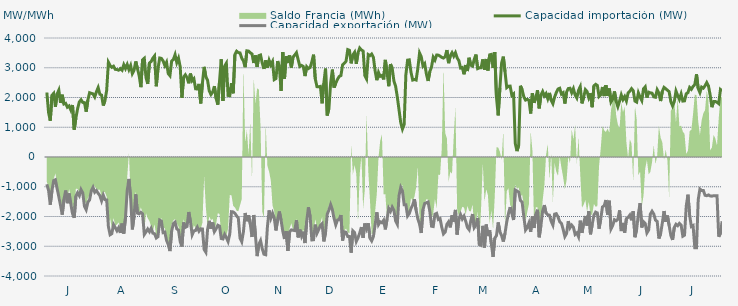
| Category | Capacidad importación (MW) | Capacidad exportación (MW) |
|---|---|---|
| 0 | 2167.583 | -916.667 |
| 1900-01-01 | 1493.75 | -1122.25 |
| 1900-01-02 | 1220.833 | -1604.167 |
| 1900-01-03 | 2072.917 | -1125 |
| 1900-01-04 | 2139.583 | -791.667 |
| 1900-01-05 | 1687.5 | -764.583 |
| 1900-01-06 | 2116.667 | -1058.333 |
| 1900-01-07 | 2247.917 | -1337.5 |
| 1900-01-08 | 1818.75 | -1627.083 |
| 1900-01-09 | 2093.75 | -1937.5 |
| 1900-01-10 | 1781.25 | -1422.917 |
| 1900-01-11 | 1804.167 | -1127.083 |
| 1900-01-12 | 1675 | -1552.083 |
| 1900-01-13 | 1716.667 | -1225 |
| 1900-01-14 | 1583.333 | -1570.833 |
| 1900-01-15 | 1747.917 | -1904.167 |
| 1900-01-16 | 918.75 | -2042.875 |
| 1900-01-17 | 1314.583 | -1310.417 |
| 1900-01-18 | 1629.167 | -1200 |
| 1900-01-19 | 1852.083 | -1300.583 |
| 1900-01-20 | 1925 | -1095.833 |
| 1900-01-21 | 1835.417 | -1208.333 |
| 1900-01-22 | 1827.083 | -1656.25 |
| 1900-01-23 | 1522.917 | -1770.917 |
| 1900-01-24 | 1916.667 | -1518.75 |
| 1900-01-25 | 2160.417 | -1441.667 |
| 1900-01-26 | 2139.583 | -1137.5 |
| 1900-01-27 | 2120.833 | -1018.75 |
| 1900-01-28 | 2018.75 | -1183.333 |
| 1900-01-29 | 2193.75 | -1127.083 |
| 1900-01-30 | 2333.333 | -1220.833 |
| 1900-01-31 | 2108.333 | -1295.833 |
| 1900-02-01 | 2079.833 | -1472.917 |
| 1900-02-02 | 1729.167 | -1281.25 |
| 1900-02-03 | 1897.917 | -1434.542 |
| 1900-02-04 | 2247 | -1443.75 |
| 1900-02-05 | 3185.083 | -2337 |
| 1900-02-06 | 3075.167 | -2613.625 |
| 1900-02-07 | 3013.625 | -2576.5 |
| 1900-02-08 | 3052.042 | -2269.25 |
| 1900-02-09 | 2946.333 | -2370.833 |
| 1900-02-10 | 2940.542 | -2478.958 |
| 1900-02-11 | 2917.208 | -2375.625 |
| 1900-02-12 | 2971.167 | -2551.875 |
| 1900-02-13 | 2917.292 | -2238 |
| 1900-02-14 | 3101.958 | -2573.167 |
| 1900-02-15 | 2973.375 | -2041.667 |
| 1900-02-16 | 3109.875 | -1120.167 |
| 1900-02-17 | 2936.333 | -737.5 |
| 1900-02-18 | 3074.833 | -1371.667 |
| 1900-02-19 | 2802.417 | -2434.917 |
| 1900-02-20 | 2913.625 | -1996.875 |
| 1900-02-21 | 3212.125 | -1254.167 |
| 1900-02-22 | 2973 | -1887.5 |
| 1900-02-23 | 2732 | -1910.417 |
| 1900-02-24 | 2348.333 | -1858 |
| 1900-02-25 | 3266 | -1911.25 |
| 1900-02-26 | 3318.417 | -2603.917 |
| 1900-02-27 | 2666.292 | -2519.292 |
| 1900-02-28 | 2457.667 | -2420.375 |
| 1900-02-28 | 3159.917 | -2510.583 |
| 1900-03-01 | 3208.208 | -2395.833 |
| 1900-03-02 | 3322.042 | -2559.25 |
| 1900-03-03 | 3397.292 | -2579.208 |
| 1900-03-04 | 2377.292 | -2722 |
| 1900-03-05 | 2966.875 | -2678.583 |
| 1900-03-06 | 3327.583 | -2120.833 |
| 1900-03-07 | 3314.125 | -2154.167 |
| 1900-03-08 | 3229.625 | -2542.417 |
| 1900-03-09 | 3075.125 | -2524.125 |
| 1900-03-10 | 3186.833 | -2800.875 |
| 1900-03-11 | 2804.417 | -2944.208 |
| 1900-03-12 | 2733.75 | -3162.5 |
| 1900-03-13 | 3225.458 | -2491.042 |
| 1900-03-14 | 3275.667 | -2238.417 |
| 1900-03-15 | 3439.5 | -2190.417 |
| 1900-03-16 | 3175.292 | -2417.375 |
| 1900-03-17 | 3321.875 | -2458.417 |
| 1900-03-18 | 3034.917 | -2846.167 |
| 1900-03-19 | 1991.917 | -3010.667 |
| 1900-03-20 | 2685.833 | -2200.25 |
| 1900-03-21 | 2763.167 | -2365.208 |
| 1900-03-22 | 2664.875 | -2334.375 |
| 1900-03-23 | 2477.792 | -1849.417 |
| 1900-03-24 | 2804.25 | -2175.083 |
| 1900-03-25 | 2563.458 | -2614.833 |
| 1900-03-26 | 2629.917 | -2484.333 |
| 1900-03-27 | 2292 | -2469.792 |
| 1900-03-28 | 2284.542 | -2356.917 |
| 1900-03-29 | 2456.5 | -2494.792 |
| 1900-03-30 | 1801.792 | -2413.833 |
| 1900-03-31 | 2484.917 | -2419 |
| 1900-04-01 | 3029.417 | -3108.292 |
| 1900-04-02 | 2693.417 | -3201.125 |
| 1900-04-03 | 2579.5 | -2439 |
| 1900-04-04 | 2220.833 | -2146.167 |
| 1900-04-05 | 2100 | -2410.292 |
| 1900-04-06 | 2179.167 | -2202.083 |
| 1900-04-07 | 2381.25 | -2508.5 |
| 1900-04-08 | 1970.833 | -2414.375 |
| 1900-04-09 | 1758.333 | -2292.792 |
| 1900-04-10 | 2544 | -2324.083 |
| 1900-04-11 | 3285.125 | -2739.75 |
| 1900-04-12 | 1885.375 | -2754.917 |
| 1900-04-13 | 3057.958 | -2601 |
| 1900-04-14 | 3152.583 | -2708.375 |
| 1900-04-15 | 2068.833 | -2840.833 |
| 1900-04-16 | 2060.917 | -2586.417 |
| 1900-04-17 | 2484.25 | -1839.417 |
| 1900-04-18 | 2141.208 | -1845.833 |
| 1900-04-19 | 3445.375 | -1893.75 |
| 1900-04-20 | 3555.25 | -1979.583 |
| 1900-04-21 | 3506.875 | -2054.167 |
| 1900-04-22 | 3499.292 | -2730 |
| 1900-04-23 | 3321.917 | -2848.375 |
| 1900-04-24 | 3225.583 | -2505.583 |
| 1900-04-25 | 3019.583 | -1882.958 |
| 1900-04-26 | 3568.667 | -2157.833 |
| 1900-04-27 | 3559.375 | -1957.75 |
| 1900-04-28 | 3503.125 | -2252.375 |
| 1900-04-29 | 3464.458 | -2689.458 |
| 1900-04-30 | 3159.52 | -1949.52 |
| 1900-05-01 | 3414.875 | -2624.75 |
| 1900-05-02 | 3028.417 | -3331.875 |
| 1900-05-03 | 3406.833 | -2936.5 |
| 1900-05-04 | 3428.875 | -2811.25 |
| 1900-05-05 | 3154.208 | -3088.625 |
| 1900-05-06 | 2961.542 | -3268.083 |
| 1900-05-07 | 3246.75 | -3285.125 |
| 1900-05-08 | 2998.792 | -2359.333 |
| 1900-05-09 | 3250.625 | -1795.833 |
| 1900-05-10 | 3098.083 | -2058.458 |
| 1900-05-11 | 3208.458 | -1889.583 |
| 1900-05-12 | 2600.833 | -2050 |
| 1900-05-13 | 2636.458 | -2468.208 |
| 1900-05-14 | 3221.75 | -2100 |
| 1900-05-15 | 3030.917 | -1831.25 |
| 1900-05-16 | 2221.417 | -2127.083 |
| 1900-05-17 | 3529.833 | -2490.5 |
| 1900-05-18 | 2631.583 | -2756.25 |
| 1900-05-19 | 3389.417 | -2493.667 |
| 1900-05-20 | 3161.917 | -3158.375 |
| 1900-05-21 | 3412.417 | -2518.792 |
| 1900-05-22 | 3004.917 | -2450.333 |
| 1900-05-23 | 3360.75 | -2463.25 |
| 1900-05-24 | 3427.958 | -2474.292 |
| 1900-05-25 | 3506.917 | -2123.5 |
| 1900-05-26 | 3269.708 | -2701.708 |
| 1900-05-27 | 3043.333 | -2440.417 |
| 1900-05-28 | 3078.833 | -2660.667 |
| 1900-05-29 | 3042.542 | -2510.25 |
| 1900-05-30 | 2720.083 | -2892.208 |
| 1900-05-31 | 3035.792 | -2156.833 |
| 1900-06-01 | 2973.125 | -1691.667 |
| 1900-06-02 | 3008.708 | -2006.25 |
| 1900-06-03 | 3198.417 | -2788.271 |
| 1900-06-04 | 3439.5 | -2780.875 |
| 1900-06-05 | 2626.625 | -2273 |
| 1900-06-06 | 2364.583 | -2564.167 |
| 1900-06-07 | 2360.417 | -2440.708 |
| 1900-06-08 | 2372.917 | -2302.125 |
| 1900-06-09 | 1804.167 | -2241.25 |
| 1900-06-10 | 2476.875 | -2836.292 |
| 1900-06-11 | 2972.208 | -2552.292 |
| 1900-06-12 | 1394.917 | -1922 |
| 1900-06-13 | 1635.417 | -1780.667 |
| 1900-06-14 | 2487.208 | -1602.083 |
| 1900-06-15 | 2938.333 | -1770.833 |
| 1900-06-16 | 2333.708 | -2058.75 |
| 1900-06-17 | 2480.333 | -2280.5 |
| 1900-06-18 | 2612.458 | -2120.333 |
| 1900-06-19 | 2705.792 | -2095.25 |
| 1900-06-20 | 2735.375 | -1951.833 |
| 1900-06-21 | 3100.375 | -2807.583 |
| 1900-06-22 | 3154.125 | -2514.417 |
| 1900-06-23 | 3216.042 | -2530.208 |
| 1900-06-24 | 3609.167 | -2672.875 |
| 1900-06-25 | 3585.958 | -2674.5 |
| 1900-06-26 | 3148.417 | -3214.25 |
| 1900-06-27 | 3433.542 | -2480.667 |
| 1900-06-28 | 3518.5 | -2539.5 |
| 1900-06-29 | 3130.292 | -2838.583 |
| 1900-06-30 | 3499.167 | -2718.417 |
| 1900-07-01 | 3663.042 | -2554.083 |
| 1900-07-02 | 3596.708 | -2355.75 |
| 1900-07-03 | 3562.792 | -2716.417 |
| 1900-07-04 | 2738.75 | -2235.333 |
| 1900-07-05 | 2625.667 | -2410 |
| 1900-07-06 | 3444.083 | -2226.333 |
| 1900-07-07 | 3408.75 | -2728 |
| 1900-07-08 | 3460.583 | -2820.25 |
| 1900-07-09 | 3350.75 | -2676.083 |
| 1900-07-10 | 2899.917 | -2289.583 |
| 1900-07-11 | 2581.708 | -1858.083 |
| 1900-07-12 | 2842.042 | -2272.417 |
| 1900-07-13 | 2711.125 | -2177.417 |
| 1900-07-14 | 2740.458 | -2209.667 |
| 1900-07-15 | 2608.583 | -2127.083 |
| 1900-07-16 | 3264.042 | -2433.083 |
| 1900-07-17 | 2836.375 | -2085.417 |
| 1900-07-18 | 2379.792 | -1727.083 |
| 1900-07-19 | 3123.25 | -1827.083 |
| 1900-07-20 | 2982.792 | -1681.25 |
| 1900-07-21 | 2556.667 | -1789.667 |
| 1900-07-22 | 2375.667 | -2149.333 |
| 1900-07-23 | 2017.208 | -2261.458 |
| 1900-07-24 | 1585 | -1297.917 |
| 1900-07-25 | 1154.167 | -1022.917 |
| 1900-07-26 | 939.583 | -1143.75 |
| 1900-07-27 | 1093.75 | -1604.167 |
| 1900-07-28 | 2763.333 | -1604.167 |
| 1900-07-29 | 3256.375 | -1980.875 |
| 1900-07-30 | 3265.958 | -1897.917 |
| 1900-07-31 | 2849.625 | -1726.333 |
| 1900-08-01 | 2586.542 | -1614.583 |
| 1900-08-02 | 2607.375 | -1416.667 |
| 1900-08-03 | 2587.208 | -1789.583 |
| 1900-08-04 | 2978.5 | -2081.25 |
| 1900-08-05 | 3497.083 | -2256.292 |
| 1900-08-06 | 3370 | -2554.542 |
| 1900-08-07 | 3061.75 | -1771.917 |
| 1900-08-08 | 3134.875 | -1562.5 |
| 1900-08-09 | 2789.5 | -1537.5 |
| 1900-08-10 | 2555.75 | -1512.5 |
| 1900-08-11 | 2867.083 | -1825 |
| 1900-08-12 | 3026.833 | -2326.458 |
| 1900-08-13 | 3354.833 | -2337.292 |
| 1900-08-14 | 3258.292 | -1924.167 |
| 1900-08-15 | 3426.125 | -1893.75 |
| 1900-08-16 | 3424.167 | -2100 |
| 1900-08-17 | 3391.208 | -2070.833 |
| 1900-08-18 | 3348.208 | -2362.208 |
| 1900-08-19 | 3325.958 | -2584.917 |
| 1900-08-20 | 3372.292 | -2526.125 |
| 1900-08-21 | 3594.458 | -2261.833 |
| 1900-08-22 | 3154.208 | -2177.542 |
| 1900-08-23 | 3406.542 | -2366 |
| 1900-08-24 | 3506.792 | -1962 |
| 1900-08-25 | 3388.292 | -2170.833 |
| 1900-08-26 | 3502.625 | -1778.917 |
| 1900-08-27 | 3329.875 | -2606.583 |
| 1900-08-28 | 3238.958 | -2081.917 |
| 1900-08-29 | 2990.542 | -1937.25 |
| 1900-08-30 | 3009.542 | -2084.208 |
| 1900-08-31 | 2780.333 | -1987.25 |
| 1900-09-01 | 3090.792 | -2157.25 |
| 1900-09-02 | 2889.375 | -2369.167 |
| 1900-09-03 | 3335.375 | -2443.917 |
| 1900-09-04 | 3086.625 | -2135.417 |
| 1900-09-05 | 3054 | -1916.417 |
| 1900-09-06 | 3285.417 | -2373 |
| 1900-09-07 | 3443.292 | -2289.333 |
| 1900-09-08 | 2971.208 | -2047.917 |
| 1900-09-09 | 2996.292 | -2944.458 |
| 1900-09-10 | 3001.167 | -2971.542 |
| 1900-09-11 | 3281.375 | -2314.833 |
| 1900-09-12 | 2936.042 | -3043.167 |
| 1900-09-13 | 3294.792 | -2270.333 |
| 1900-09-14 | 2907.375 | -2657.667 |
| 1900-09-15 | 3433.583 | -2462.5 |
| 1900-09-16 | 3449.042 | -2914.583 |
| 1900-09-17 | 2992.458 | -3358.458 |
| 1900-09-18 | 3524.375 | -2728.208 |
| 1900-09-19 | 2000 | -2643.375 |
| 1900-09-20 | 1400 | -2200 |
| 1900-09-21 | 2323.375 | -2514.75 |
| 1900-09-22 | 3160.167 | -2645.333 |
| 1900-09-23 | 3372.083 | -2842.167 |
| 1900-09-24 | 2865.739 | -2564.565 |
| 1900-09-25 | 2332.667 | -2181.833 |
| 1900-09-26 | 2376.083 | -1906.25 |
| 1900-09-27 | 2381.25 | -1683.333 |
| 1900-09-28 | 2070.833 | -1891.667 |
| 1900-09-29 | 2120.083 | -2118.75 |
| 1900-09-30 | 449.25 | -1108.333 |
| 1900-10-01 | 200 | -1139.583 |
| 1900-10-02 | 395.833 | -1179.167 |
| 1900-10-03 | 2393.75 | -1462.5 |
| 1900-10-04 | 2262.25 | -1512.5 |
| 1900-10-05 | 2020.833 | -2007.167 |
| 1900-10-06 | 1912.5 | -2455.208 |
| 1900-10-07 | 1939.583 | -2371.125 |
| 1900-10-08 | 1908.333 | -2217.958 |
| 1900-10-09 | 1462.5 | -2517.542 |
| 1900-10-10 | 2145.208 | -2000.417 |
| 1900-10-11 | 1820.833 | -2386.167 |
| 1900-10-12 | 1983.333 | -1930.75 |
| 1900-10-13 | 2245.833 | -1772.917 |
| 1900-10-14 | 1635.417 | -2697.5 |
| 1900-10-15 | 2079.167 | -2299.625 |
| 1900-10-16 | 2200 | -1818.75 |
| 1900-10-17 | 2052.083 | -1616.667 |
| 1900-10-18 | 2133.333 | -1885.417 |
| 1900-10-19 | 1962.5 | -1940.792 |
| 1900-10-20 | 2154.167 | -1955.875 |
| 1900-10-21 | 1906.25 | -2160.458 |
| 1900-10-22 | 1791.667 | -2289.583 |
| 1900-10-23 | 2014.583 | -1920.333 |
| 1900-10-24 | 2166.667 | -1904.167 |
| 1900-10-25 | 2285.417 | -2016.25 |
| 1900-10-26 | 2310.417 | -2177.917 |
| 1900-10-27 | 2114.583 | -2230.875 |
| 1900-10-28 | 2160.417 | -2431.625 |
| 1900-10-29 | 1797.917 | -2674.417 |
| 1900-10-30 | 2180.625 | -2574 |
| 1900-10-31 | 2300 | -2155.333 |
| 1900-11-01 | 2310.417 | -2380.708 |
| 1900-11-02 | 2160.417 | -2290.5 |
| 1900-11-03 | 2295.833 | -2360.958 |
| 1900-11-04 | 2083.333 | -2603 |
| 1900-11-05 | 1983.333 | -2551.458 |
| 1900-11-06 | 2243.75 | -2680.375 |
| 1900-11-07 | 2364.583 | -2139.583 |
| 1900-11-08 | 1802.083 | -2551.375 |
| 1900-11-09 | 2012.5 | -2222.583 |
| 1900-11-10 | 2264.583 | -1983.333 |
| 1900-11-11 | 2200 | -2304.167 |
| 1900-11-12 | 1991.667 | -1823 |
| 1900-11-13 | 2139.583 | -2598.667 |
| 1900-11-14 | 1674.583 | -2262.5 |
| 1900-11-15 | 2391.667 | -1958.333 |
| 1900-11-16 | 2442.875 | -1852.083 |
| 1900-11-17 | 2406.25 | -1879.167 |
| 1900-11-18 | 2035.417 | -2408.5 |
| 1900-11-19 | 2093.75 | -2077.083 |
| 1900-11-20 | 2353.042 | -1679.167 |
| 1900-11-21 | 2047.917 | -1637.5 |
| 1900-11-22 | 2414.917 | -1445.833 |
| 1900-11-23 | 2054.167 | -1935.417 |
| 1900-11-24 | 2304.167 | -1468.75 |
| 1900-11-25 | 1852.083 | -2413.583 |
| 1900-11-26 | 1950 | -2298.583 |
| 1900-11-27 | 2204.167 | -2108.333 |
| 1900-11-28 | 1870.833 | -2142.875 |
| 1900-11-29 | 1693.75 | -2094.083 |
| 1900-11-30 | 1875 | -1793.75 |
| 1900-12-01 | 2087.5 | -2489.25 |
| 1900-12-02 | 1929.167 | -2216.167 |
| 1900-12-03 | 2031.25 | -2542 |
| 1900-12-04 | 1885.417 | -2072.833 |
| 1900-12-05 | 2156.25 | -2029.167 |
| 1900-12-06 | 2208.333 | -1953 |
| 1900-12-07 | 2297.917 | -2127.083 |
| 1900-12-08 | 2229.167 | -1822.917 |
| 1900-12-09 | 1879.167 | -2695.583 |
| 1900-12-10 | 1845.833 | -2427.667 |
| 1900-12-11 | 2156.25 | -1908.417 |
| 1900-12-12 | 2010.417 | -1551.375 |
| 1900-12-13 | 1897.625 | -2367.333 |
| 1900-12-14 | 2291.667 | -2179.167 |
| 1900-12-15 | 2358.333 | -2236.833 |
| 1900-12-16 | 1997.917 | -2551.708 |
| 1900-12-17 | 2179.167 | -2457.875 |
| 1900-12-18 | 2156.25 | -1922.667 |
| 1900-12-19 | 2145.833 | -1823.917 |
| 1900-12-20 | 2022.917 | -1916.417 |
| 1900-12-21 | 2008.333 | -2121.167 |
| 1900-12-22 | 2260.417 | -2164.667 |
| 1900-12-23 | 2152.083 | -2739.958 |
| 1900-12-24 | 1881 | -2582.833 |
| 1900-12-25 | 2206.25 | -2222.083 |
| 1900-12-26 | 2339.583 | -1816.667 |
| 1900-12-27 | 2293.75 | -2177.833 |
| 1900-12-28 | 2245.833 | -1968.75 |
| 1900-12-29 | 2195.833 | -2304.458 |
| 1900-12-30 | 1858.208 | -2638.917 |
| 1900-12-31 | 1718.75 | -2788.083 |
| 1901-01-01 | 1858.333 | -2369.542 |
| 1901-01-02 | 2216.667 | -2260.583 |
| 1901-01-03 | 2066.667 | -2309.375 |
| 1901-01-04 | 1935.417 | -2231 |
| 1901-01-05 | 2118.292 | -2285.25 |
| 1901-01-06 | 1879.583 | -2663 |
| 1901-01-07 | 1887.5 | -2627.5 |
| 1901-01-08 | 2127.083 | -1647.917 |
| 1901-01-09 | 2162.5 | -1266.667 |
| 1901-01-10 | 2338.667 | -1964.583 |
| 1901-01-11 | 2277.083 | -2337.25 |
| 1901-01-12 | 2373.75 | -2304.167 |
| 1901-01-13 | 2435.083 | -3048.333 |
| 1901-01-14 | 2780.708 | -3048.208 |
| 1901-01-15 | 2300 | -1435 |
| 1901-01-16 | 2164.583 | -1077.083 |
| 1901-01-17 | 2350 | -1125 |
| 1901-01-18 | 2314.583 | -1125 |
| 1901-01-19 | 2395.625 | -1287.5 |
| 1901-01-20 | 2501.583 | -1302.083 |
| 1901-01-21 | 2389.417 | -1275 |
| 1901-01-22 | 2080.375 | -1308.333 |
| 1901-01-23 | 1675 | -1316.667 |
| 1901-01-24 | 1862.5 | -1300 |
| 1901-01-25 | 1866.708 | -1300 |
| 1901-01-26 | 1837.292 | -1300 |
| 1901-01-27 | 1793.75 | -2680.333 |
| 1901-01-28 | 2268.333 | -2563.75 |
| 1901-01-29 | 2217.333 | -2160.333 |